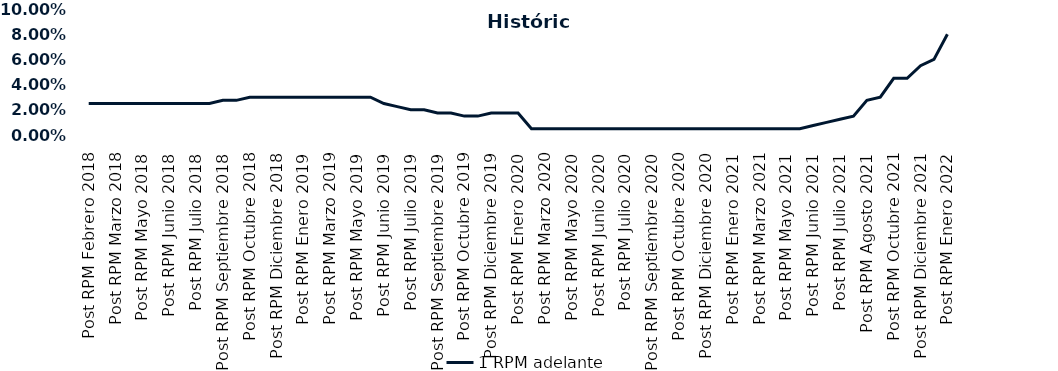
| Category | 1 RPM adelante |
|---|---|
| Post RPM Febrero 2018 | 0.025 |
| Pre RPM Marzo 2018 | 0.025 |
| Post RPM Marzo 2018 | 0.025 |
| Pre RPM Mayo 2018 | 0.025 |
| Post RPM Mayo 2018 | 0.025 |
| Pre RPM Junio 2018 | 0.025 |
| Post RPM Junio 2018 | 0.025 |
| Pre RPM Julio 2018 | 0.025 |
| Post RPM Julio 2018 | 0.025 |
| Pre RPM Septiembre 2018 | 0.025 |
| Post RPM Septiembre 2018 | 0.028 |
| Pre RPM Octubre 2018 | 0.028 |
| Post RPM Octubre 2018 | 0.03 |
| Pre RPM Diciembre 2018 | 0.03 |
| Post RPM Diciembre 2018 | 0.03 |
| Pre RPM Enero 2019 | 0.03 |
| Post RPM Enero 2019 | 0.03 |
| Pre RPM Marzo 2019 | 0.03 |
| Post RPM Marzo 2019 | 0.03 |
| Pre RPM Mayo 2019 | 0.03 |
| Post RPM Mayo 2019 | 0.03 |
| Pre RPM Junio 2019 | 0.03 |
| Post RPM Junio 2019 | 0.025 |
| Pre RPM Julio 2019 | 0.022 |
| Post RPM Julio 2019 | 0.02 |
| Pre RPM Septiembre 2019 | 0.02 |
| Post RPM Septiembre 2019 | 0.018 |
| Pre RPM Octubre 2019 | 0.018 |
| Post RPM Octubre 2019 | 0.015 |
| Pre RPM Diciembre 2019 | 0.015 |
| Post RPM Diciembre 2019 | 0.018 |
| Pre RPM Enero 2020 | 0.018 |
| Post RPM Enero 2020 | 0.018 |
| Pre RPM Marzo 2020 | 0.005 |
| Post RPM Marzo 2020 | 0.005 |
| Pre RPM Mayo 2020 | 0.005 |
| Post RPM Mayo 2020 | 0.005 |
| Pre RPM Junio 2020 | 0.005 |
| Post RPM Junio 2020 | 0.005 |
| Pre RPM Julio 2020 | 0.005 |
| Post RPM Julio 2020 | 0.005 |
| Pre RPM Septiembre 2020 | 0.005 |
| Post RPM Septiembre 2020 | 0.005 |
| Pre RPM Octubre 2020 | 0.005 |
| Post RPM Octubre 2020 | 0.005 |
| Pre RPM Diciembre 2020 | 0.005 |
| Post RPM Diciembre 2020 | 0.005 |
| Pre RPM Enero 2021 | 0.005 |
| Post RPM Enero 2021 | 0.005 |
| Pre RPM Marzo 2021 | 0.005 |
| Post RPM Marzo 2021 | 0.005 |
| Pre RPM Mayo 2021 | 0.005 |
| Post RPM Mayo 2021 | 0.005 |
| Pre RPM Junio 2021 | 0.005 |
| Post RPM Junio 2021 | 0.008 |
| Pre RPM Julio 2021 | 0.01 |
| Post RPM Julio 2021 | 0.012 |
| Pre RPM Agosto 2021 | 0.015 |
| Post RPM Agosto 2021 | 0.028 |
| Pre RPM Octubre 2021 | 0.03 |
| Post RPM Octubre 2021 | 0.045 |
| Pre RPM Diciembre 2021 | 0.045 |
| Post RPM Diciembre 2021 | 0.055 |
| Pre RPM Enero 2022 | 0.06 |
| Post RPM Enero 2022 | 0.08 |